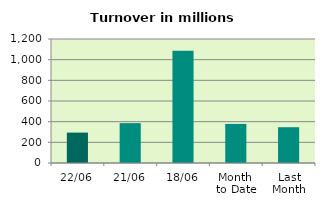
| Category | Series 0 |
|---|---|
| 22/06 | 294.193 |
| 21/06 | 385.791 |
| 18/06 | 1086.988 |
| Month 
to Date | 378.255 |
| Last
Month | 346.329 |